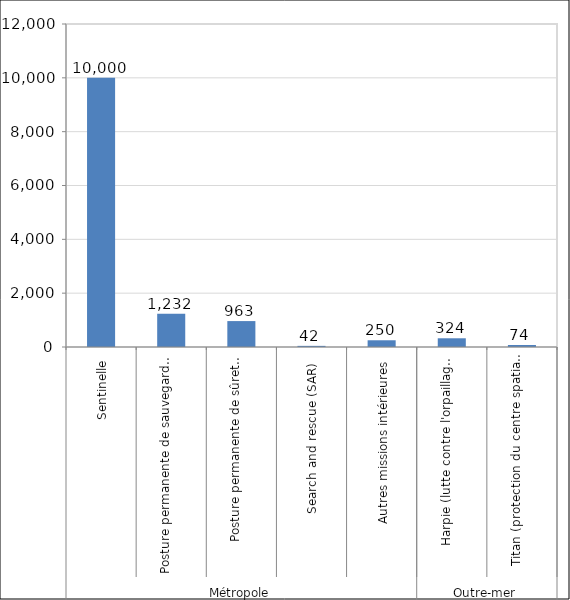
| Category | Effectif  |
|---|---|
| 0 | 10000 |
| 1 | 1232 |
| 2 | 963 |
| 3 | 42 |
| 4 | 250 |
| 5 | 324 |
| 6 | 74 |